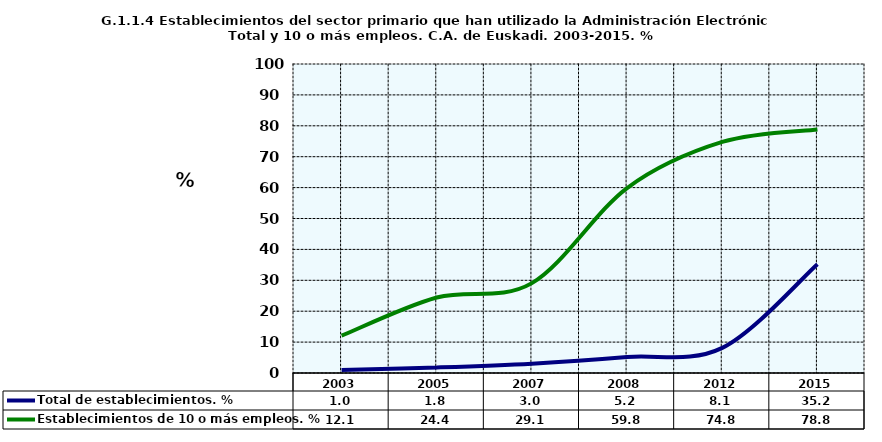
| Category | Total de establecimientos. % | Establecimientos de 10 o más empleos. % |
|---|---|---|
| 2003.0 | 0.969 | 12.077 |
| 2005.0 | 1.791 | 24.444 |
| 2007.0 | 3.033 | 29.082 |
| 2008.0 | 5.176 | 59.848 |
| 2012.0 | 8.118 | 74.783 |
| 2015.0 | 35.191 | 78.832 |